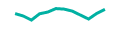
| Category | Series 0 |
|---|---|
| 0 | 0.67 |
| 1 | 0.55 |
| 2 | 0.346 |
| 3 | 0.661 |
| 4 | 0.747 |
| 5 | 0.921 |
| 6 | 0.894 |
| 7 | 0.796 |
| 8 | 0.597 |
| 9 | 0.399 |
| 10 | 0.679 |
| 11 | 0.883 |